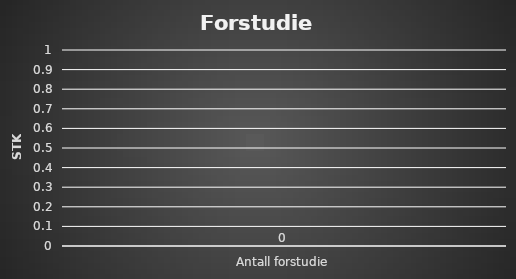
| Category | Series 0 |
|---|---|
| Antall forstudie | 0 |